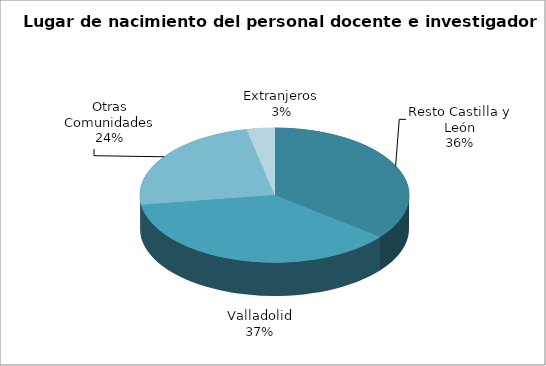
| Category | Series 0 |
|---|---|
| Resto Castilla y León | 886 |
| Valladolid | 920 |
| Otras Comunidades | 595 |
| Extranjeros | 83 |